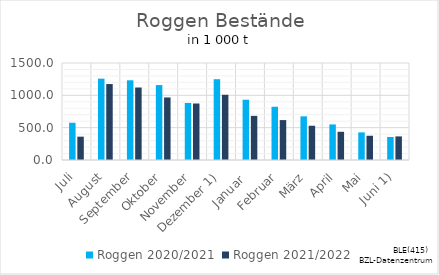
| Category | Roggen |
|---|---|
| Juli | 360.803 |
| August | 1174.604 |
| September | 1121.168 |
| Oktober | 967.494 |
| November | 873.688 |
| Dezember 1) | 1008.716 |
| Januar  | 682.249 |
| Februar | 617.39 |
| März | 529.671 |
| April | 436.363 |
| Mai | 374.854 |
| Juni 1) | 364.791 |